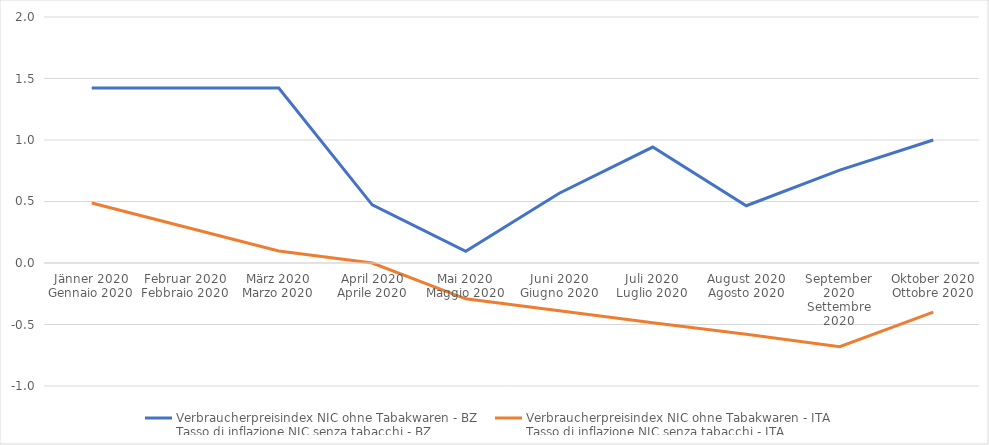
| Category | Verbraucherpreisindex NIC ohne Tabakwaren - BZ
Tasso di inflazione NIC senza tabacchi - BZ | Verbraucherpreisindex NIC ohne Tabakwaren - ITA
Tasso di inflazione NIC senza tabacchi - ITA |
|---|---|---|
| Jänner 2020
Gennaio 2020 | 1.422 | 0.488 |
| Februar 2020
Febbraio 2020 | 1.422 | 0.293 |
| März 2020
Marzo 2020 | 1.422 | 0.097 |
| April 2020
Aprile 2020 | 0.473 | 0 |
| Mai 2020
Maggio 2020 | 0.095 | -0.291 |
| Juni 2020
Giugno 2020 | 0.567 | -0.388 |
| Juli 2020
Luglio 2020 | 0.943 | -0.485 |
| August 2020
Agosto 2020 | 0.466 | -0.58 |
| September 2020
Settembre 2020 | 0.755 | -0.68 |
| Oktober 2020
Ottobre 2020 | 1 | -0.4 |